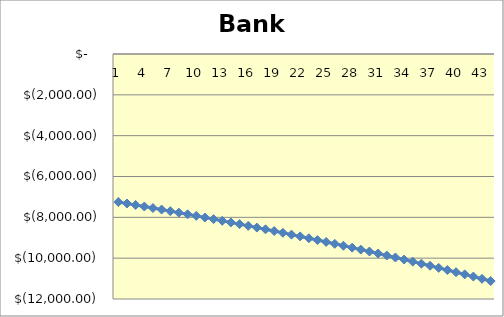
| Category | Series 0 |
|---|---|
| 0 | -7250 |
| 1 | -7322.5 |
| 2 | -7395.725 |
| 3 | -7469.682 |
| 4 | -7544.379 |
| 5 | -7619.823 |
| 6 | -7696.021 |
| 7 | -7772.981 |
| 8 | -7850.711 |
| 9 | -7929.218 |
| 10 | -8008.51 |
| 11 | -8088.596 |
| 12 | -8169.481 |
| 13 | -8251.176 |
| 14 | -8333.688 |
| 15 | -8417.025 |
| 16 | -8501.195 |
| 17 | -8586.207 |
| 18 | -8672.069 |
| 19 | -8758.79 |
| 20 | -8846.378 |
| 21 | -8934.842 |
| 22 | -9024.19 |
| 23 | -9114.432 |
| 24 | -9205.576 |
| 25 | -9297.632 |
| 26 | -9390.608 |
| 27 | -9484.514 |
| 28 | -9579.36 |
| 29 | -9675.153 |
| 30 | -9771.905 |
| 31 | -9869.624 |
| 32 | -9968.32 |
| 33 | -10068.003 |
| 34 | -10168.683 |
| 35 | -10270.37 |
| 36 | -10373.074 |
| 37 | -10476.804 |
| 38 | -10581.572 |
| 39 | -10687.388 |
| 40 | -10794.262 |
| 41 | -10902.205 |
| 42 | -11011.227 |
| 43 | -11121.339 |